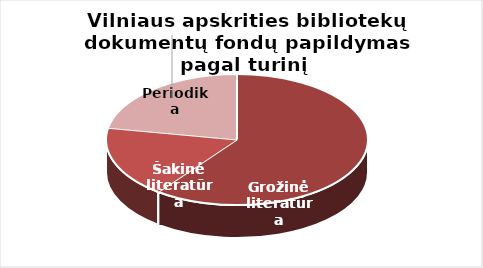
| Category | Series 0 |
|---|---|
| Grožinė literatūra | 62652 |
| Šakinė literatūra | 18353 |
| Periodika | 22989 |